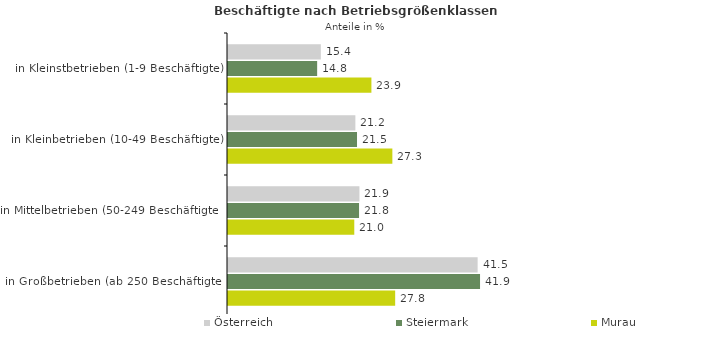
| Category | Österreich | Steiermark | Murau |
|---|---|---|---|
| in Kleinstbetrieben (1-9 Beschäftigte) | 15.439 | 14.827 | 23.851 |
| in Kleinbetrieben (10-49 Beschäftigte) | 21.184 | 21.458 | 27.337 |
| in Mittelbetrieben (50-249 Beschäftigte) | 21.859 | 21.796 | 21.003 |
| in Großbetrieben (ab 250 Beschäftigte) | 41.518 | 41.919 | 27.803 |